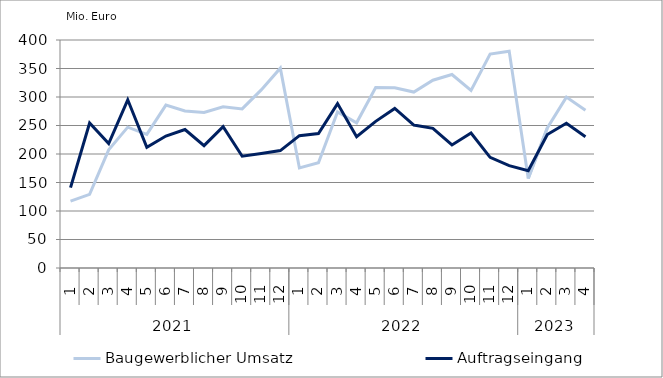
| Category | Baugewerblicher Umsatz | Auftragseingang |
|---|---|---|
| 0 | 117421.805 | 141020.655 |
| 1 | 129162.55 | 254416.876 |
| 2 | 207280.837 | 218451.405 |
| 3 | 247094.279 | 295077.868 |
| 4 | 234515.312 | 211696.129 |
| 5 | 285732.845 | 231455.155 |
| 6 | 275480.885 | 242932.505 |
| 7 | 272787.524 | 214636.944 |
| 8 | 282850.254 | 247827.991 |
| 9 | 279173.21 | 196069.238 |
| 10 | 312511.437 | 201015.897 |
| 11 | 350582.01 | 205949.991 |
| 12 | 175456.852 | 232178.255 |
| 13 | 184578.32 | 236006.862 |
| 14 | 273732.567 | 288451.109 |
| 15 | 254683.671 | 230228.968 |
| 16 | 316794.568 | 257235.39 |
| 17 | 316277.567 | 279900.179 |
| 18 | 308621.034 | 250827.343 |
| 19 | 329490.411 | 244949.341 |
| 20 | 339435.208 | 215809.075 |
| 21 | 311599.811 | 236674.056 |
| 22 | 375203.994 | 194107.214 |
| 23 | 380445.583 | 179631.624 |
| 24 | 156885.157 | 170764.939 |
| 25 | 245647.016 | 234064.391 |
| 26 | 299793.904 | 253873.168 |
| 27 | 276653.498 | 230304.701 |